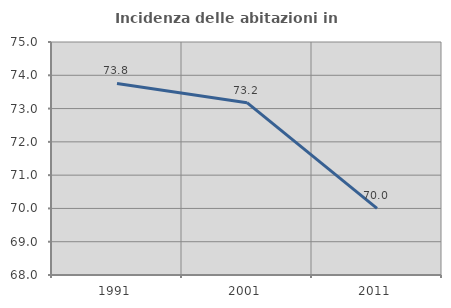
| Category | Incidenza delle abitazioni in proprietà  |
|---|---|
| 1991.0 | 73.753 |
| 2001.0 | 73.176 |
| 2011.0 | 70 |